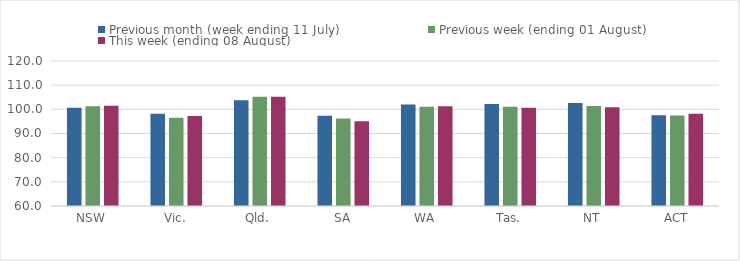
| Category | Previous month (week ending 11 July) | Previous week (ending 01 August) | This week (ending 08 August) |
|---|---|---|---|
| NSW | 100.623 | 101.309 | 101.477 |
| Vic. | 98.14 | 96.488 | 97.291 |
| Qld. | 103.744 | 105.196 | 105.196 |
| SA | 97.345 | 96.237 | 95.113 |
| WA | 102.018 | 101.111 | 101.299 |
| Tas. | 102.204 | 101.018 | 100.633 |
| NT | 102.577 | 101.426 | 100.909 |
| ACT | 97.571 | 97.489 | 98.192 |